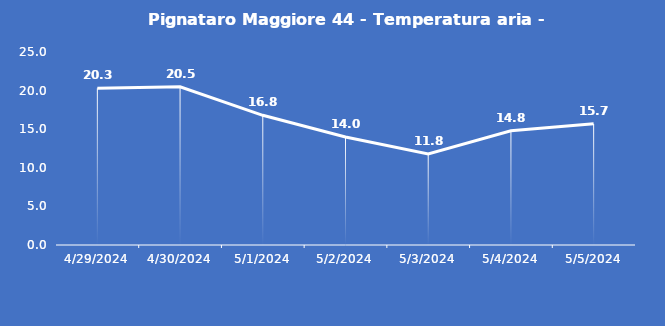
| Category | Pignataro Maggiore 44 - Temperatura aria - Grezzo (°C) |
|---|---|
| 4/29/24 | 20.3 |
| 4/30/24 | 20.5 |
| 5/1/24 | 16.8 |
| 5/2/24 | 14 |
| 5/3/24 | 11.8 |
| 5/4/24 | 14.8 |
| 5/5/24 | 15.7 |